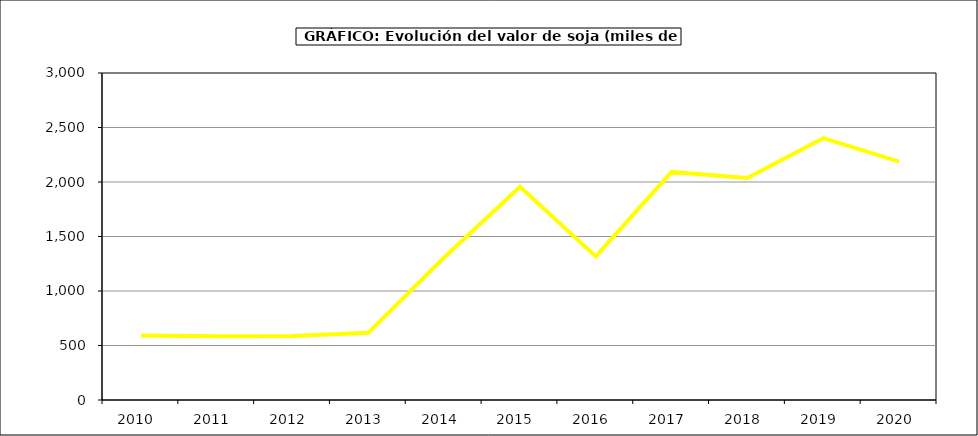
| Category | Valor |
|---|---|
| 2010.0 | 592.162 |
| 2011.0 | 584.814 |
| 2012.0 | 588.253 |
| 2013.0 | 616.743 |
| 2014.0 | 1308.04 |
| 2015.0 | 1956 |
| 2016.0 | 1317 |
| 2017.0 | 2092.786 |
| 2018.0 | 2037.396 |
| 2019.0 | 2402.196 |
| 2020.0 | 2187.061 |